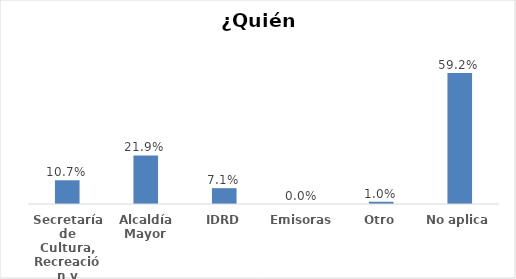
| Category | Series 0 |
|---|---|
| Secretaría de Cultura, Recreación y Deporte | 0.107 |
| Alcaldía Mayor | 0.219 |
| IDRD | 0.071 |
| Emisoras | 0 |
| Otro | 0.01 |
| No aplica | 0.592 |